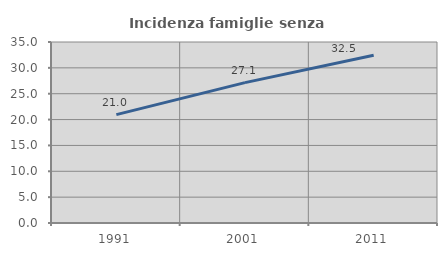
| Category | Incidenza famiglie senza nuclei |
|---|---|
| 1991.0 | 20.961 |
| 2001.0 | 27.14 |
| 2011.0 | 32.45 |